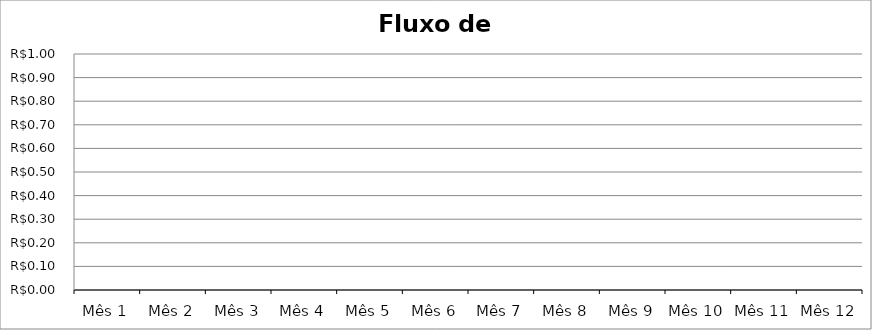
| Category | Saldo Acumulado (Saldo Operacional + Saldo Inicial) |
|---|---|
| Mês 1 | 0 |
| Mês 2 | 0 |
| Mês 3 | 0 |
| Mês 4 | 0 |
| Mês 5 | 0 |
| Mês 6 | 0 |
| Mês 7 | 0 |
| Mês 8 | 0 |
| Mês 9 | 0 |
| Mês 10 | 0 |
| Mês 11 | 0 |
| Mês 12 | 0 |